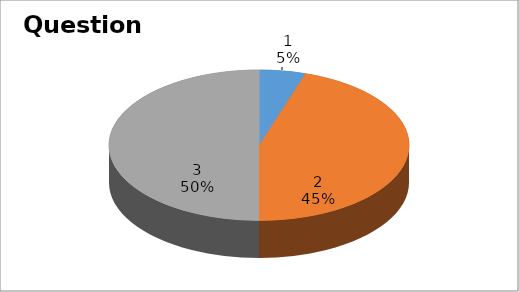
| Category | Series 0 |
|---|---|
| 0 | 1 |
| 1 | 9 |
| 2 | 10 |